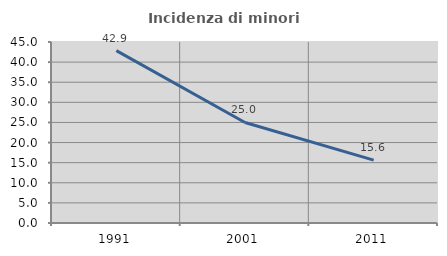
| Category | Incidenza di minori stranieri |
|---|---|
| 1991.0 | 42.857 |
| 2001.0 | 25 |
| 2011.0 | 15.625 |